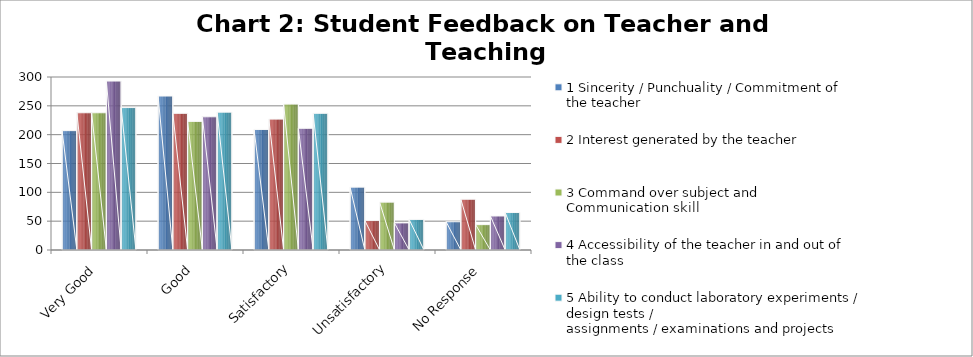
| Category | 1 Sincerity / Punchuality / Commitment of the teacher | 2 Interest generated by the teacher | 3 Command over subject and Communication skill | 4 Accessibility of the teacher in and out of the class | 5 Ability to conduct laboratory experiments / design tests /
assignments / examinations and projects |
|---|---|---|---|---|---|
| Very Good | 207 | 238 | 238 | 293 | 247 |
| Good | 267 | 237 | 223 | 231 | 239 |
| Satisfactory | 209 | 227 | 253 | 211 | 237 |
| Unsatisfactory | 109 | 51 | 83 | 47 | 53 |
| No Response | 49 | 88 | 44 | 59 | 65 |